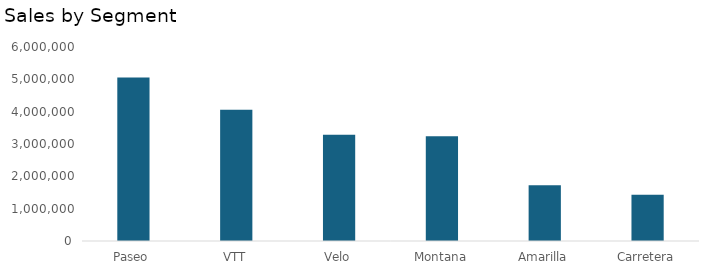
| Category | Total |
|---|---|
| Paseo | 5057477.19 |
| VTT | 4058418.84 |
| Velo | 3286980.88 |
| Montana | 3240667.61 |
| Amarilla | 1723191.825 |
| Carretera | 1432118.97 |